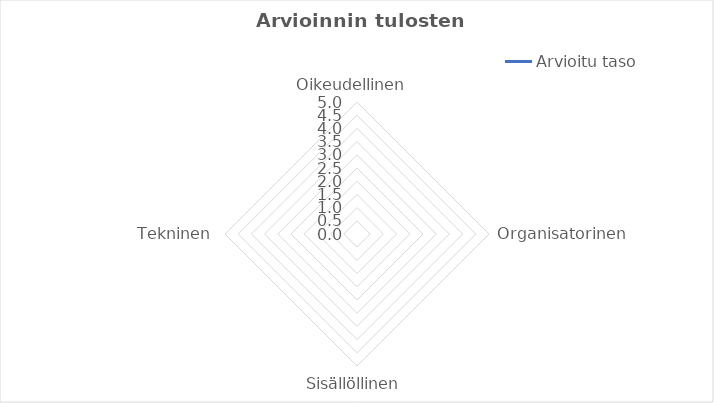
| Category | Arvioitu taso |
|---|---|
| Oikeudellinen  | 0 |
| Organisatorinen | 0 |
| Sisällöllinen | 0 |
| Tekninen | 0 |